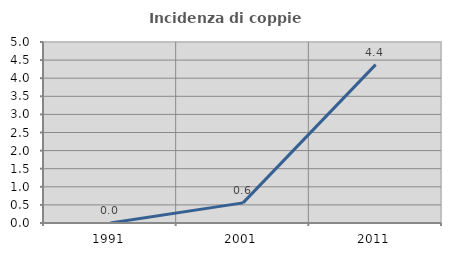
| Category | Incidenza di coppie miste |
|---|---|
| 1991.0 | 0 |
| 2001.0 | 0.556 |
| 2011.0 | 4.375 |